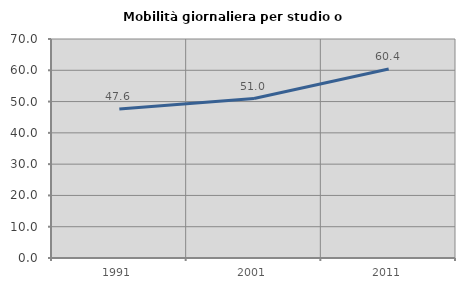
| Category | Mobilità giornaliera per studio o lavoro |
|---|---|
| 1991.0 | 47.619 |
| 2001.0 | 50.98 |
| 2011.0 | 60.44 |